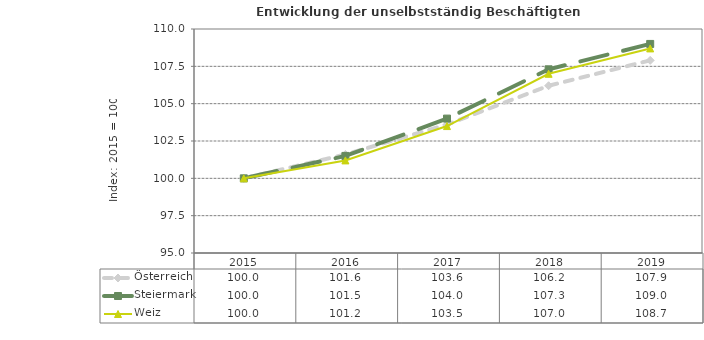
| Category | Österreich | Steiermark | Weiz |
|---|---|---|---|
| 2019.0 | 107.9 | 109 | 108.7 |
| 2018.0 | 106.2 | 107.3 | 107 |
| 2017.0 | 103.6 | 104 | 103.5 |
| 2016.0 | 101.6 | 101.5 | 101.2 |
| 2015.0 | 100 | 100 | 100 |